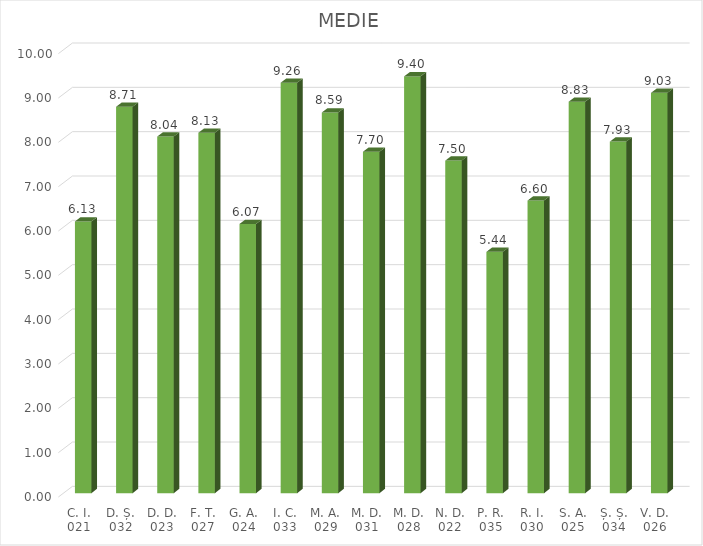
| Category | MEDIE |
|---|---|
| C. I. 021 | 6.129 |
| D. Ș. 032 | 8.714 |
| D. D. 023 | 8.043 |
| F. T. 027 | 8.129 |
| G. A. 024 | 6.071 |
| I. C. 033 | 9.257 |
| M. A. 029 | 8.586 |
| M. D. 031 | 7.7 |
| M. D. 028 | 9.4 |
| N. D. 022 | 7.5 |
| P. R. 035 | 5.443 |
| R. I. 030 | 6.6 |
| S. A. 025 | 8.829 |
| Ș. Ș. 034 | 7.929 |
| V. D. 026 | 9.029 |